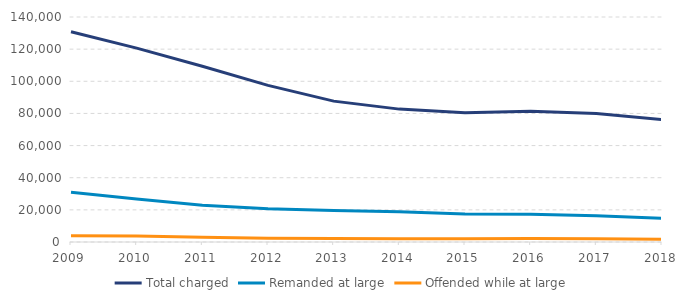
| Category | Total charged | Remanded at large | Offended while at large |
|---|---|---|---|
| 2009.0 | 130846 | 30989 | 3929 |
| 2010.0 | 120636 | 26825 | 3675 |
| 2011.0 | 109366 | 22924 | 2905 |
| 2012.0 | 97431 | 20728 | 2406 |
| 2013.0 | 87656 | 19523 | 2187 |
| 2014.0 | 82684 | 18779 | 2026 |
| 2015.0 | 80383 | 17348 | 2045 |
| 2016.0 | 81318 | 17333 | 2228 |
| 2017.0 | 79981 | 16303 | 2090 |
| 2018.0 | 76190 | 14735 | 1710 |